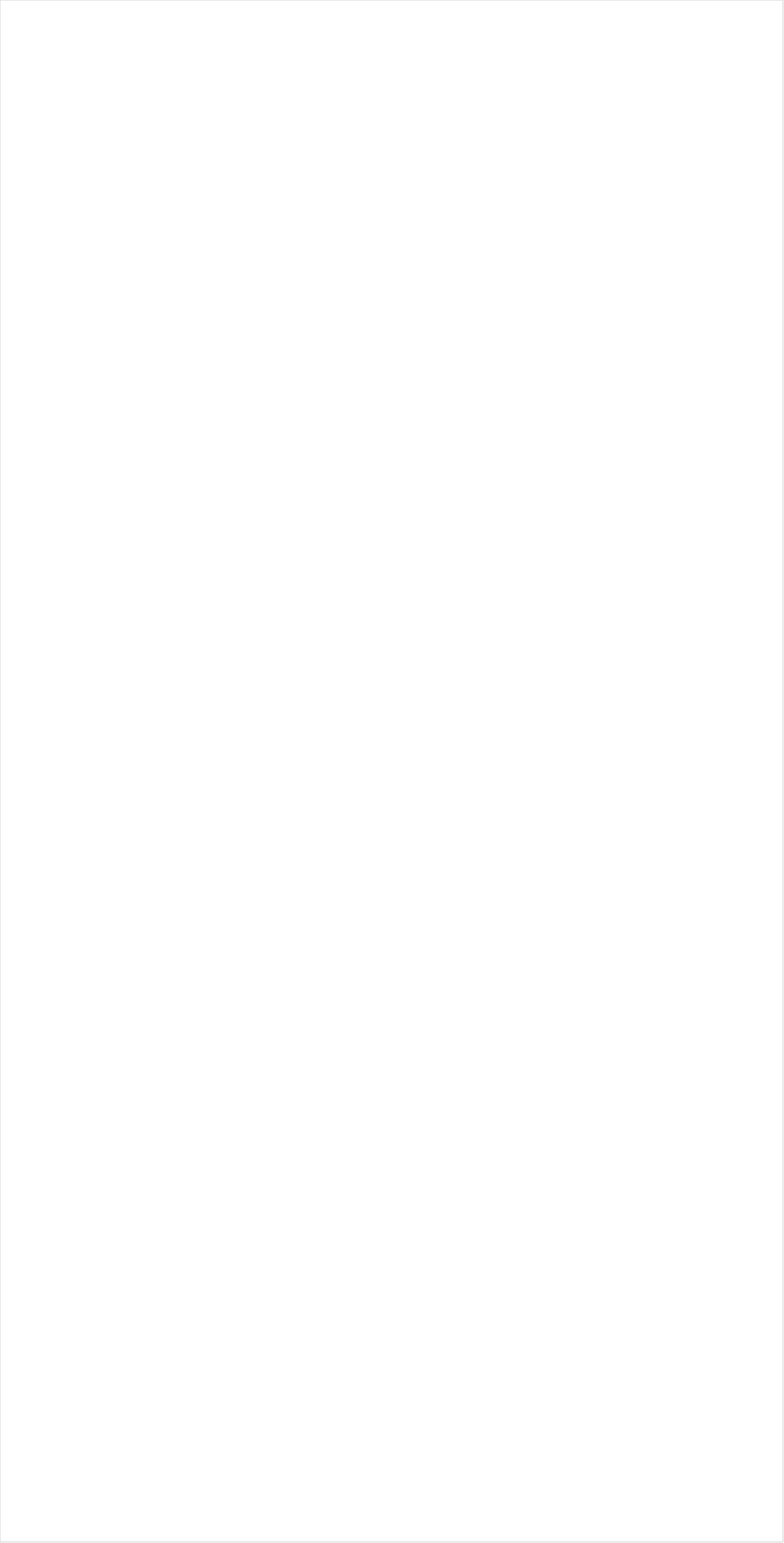
| Category | Total |
|---|---|
| Galavision | -0.935 |
| TUDN | -0.914 |
| Telemundo | -0.902 |
| Univision | -0.9 |
| UniMas | -0.891 |
| NBC Universo | -0.831 |
| BET Her | -0.71 |
| BET | -0.69 |
| VH1 | -0.682 |
| TV ONE | -0.667 |
| MTV2 | -0.641 |
| Cartoon Network | -0.489 |
| Nick Toons | -0.458 |
| Disney Channel | -0.423 |
| MSNBC | -0.412 |
| Adult Swim | -0.411 |
| Oprah Winfrey Network | -0.392 |
| NBA TV | -0.384 |
| Nick Jr. | -0.377 |
| Teen Nick | -0.357 |
| Lifetime Movies | -0.355 |
| Nick | -0.353 |
| Nick@Nite | -0.339 |
| CNN | -0.324 |
| BRAVO | -0.305 |
| Disney Junior US | -0.273 |
| ESPN Deportes | -0.263 |
| Discovery Life Channel | -0.224 |
| TLC | -0.222 |
| Lifetime | -0.207 |
| WE TV | -0.204 |
| Universal Kids | -0.181 |
| MyNetworkTV | -0.135 |
| Tennis Channel | -0.13 |
| Logo | -0.106 |
| E! | -0.097 |
| FXX | -0.093 |
| MTV | -0.09 |
| Disney XD | -0.089 |
| FX | -0.057 |
| Golf | -0.037 |
| Freeform | -0.036 |
| HGTV | -0.029 |
| Hallmark | -0.022 |
| truTV | -0.007 |
| Investigation Discovery | -0.007 |
| ESPN2 | -0.006 |
| Hallmark Movies & Mysteries | 0.004 |
| FX Movie Channel | 0.029 |
| Discovery Family Channel | 0.033 |
| OXYGEN | 0.037 |
| PBS | 0.037 |
| Bloomberg HD | 0.039 |
| TNT | 0.041 |
| SYFY | 0.049 |
| Comedy Central | 0.061 |
| CW | 0.063 |
| ION | 0.088 |
| CNBC | 0.105 |
| Game Show | 0.11 |
| UP TV | 0.113 |
| ESPN | 0.127 |
| TBS | 0.128 |
| ABC | 0.13 |
| BBC America | 0.145 |
| Travel | 0.148 |
| Headline News | 0.154 |
| Food Network | 0.171 |
| Olympic Channel | 0.177 |
| USA Network | 0.189 |
| POP | 0.224 |
| NBC | 0.241 |
| Independent Film (IFC) | 0.255 |
| Cooking Channel | 0.267 |
| PAC-12 Network | 0.276 |
| AMC | 0.286 |
| SundanceTV | 0.297 |
| Ovation | 0.308 |
| NHL | 0.341 |
| Paramount Network | 0.353 |
| CBS | 0.366 |
| Big Ten Network | 0.372 |
| TV LAND | 0.378 |
| Reelz Channel | 0.379 |
| Viceland | 0.386 |
| CMTV | 0.394 |
| Fox Business | 0.395 |
| FOX | 0.427 |
| National Geographic Wild | 0.451 |
| Fox News | 0.461 |
| NFL Network | 0.5 |
| WGN America | 0.507 |
| MLB Network | 0.522 |
| A&E | 0.524 |
| ESPNU | 0.53 |
| Great American Country | 0.568 |
| Destination America | 0.586 |
| Smithsonian | 0.609 |
| INSP | 0.65 |
| National Geographic | 0.693 |
| DIY | 0.697 |
| American Heroes Channel | 0.711 |
| Science Channel | 0.72 |
| History Channel | 0.737 |
| Animal Planet | 0.747 |
| ESPNEWS | 0.757 |
| NBC Sports | 0.786 |
| FYI | 0.917 |
| Discovery Channel | 0.972 |
| The Sportsman Channel | 1.081 |
| Weather Channel | 1.084 |
| FXDEP | 1.107 |
| Outdoor Channel | 1.298 |
| RFD TV | 1.516 |
| Motor Trend Network | 1.636 |
| CBS Sports | 2.134 |
| Fox Sports 1 | 2.775 |
| FOX Sports 2 | 4.467 |